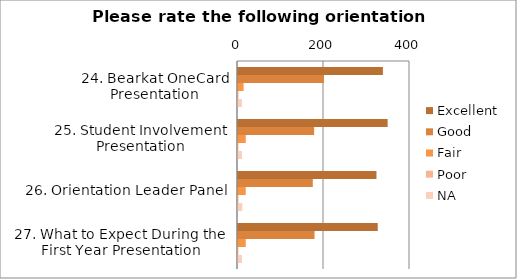
| Category | Excellent | Good | Fair | Poor | NA |
|---|---|---|---|---|---|
| 24. Bearkat OneCard Presentation | 337 | 200 | 13 | 1 | 9 |
| 25. Student Involvement Presentation | 348 | 177 | 18 | 1 | 9 |
| 26. Orientation Leader Panel | 322 | 174 | 18 | 1 | 10 |
| 27. What to Expect During the First Year Presentation | 325 | 178 | 18 | 1 | 9 |